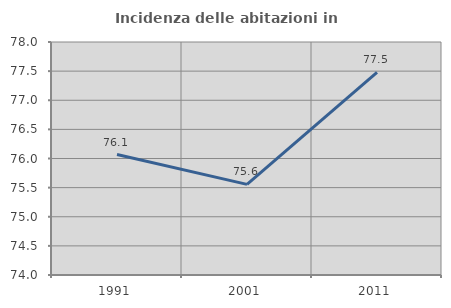
| Category | Incidenza delle abitazioni in proprietà  |
|---|---|
| 1991.0 | 76.068 |
| 2001.0 | 75.556 |
| 2011.0 | 77.48 |